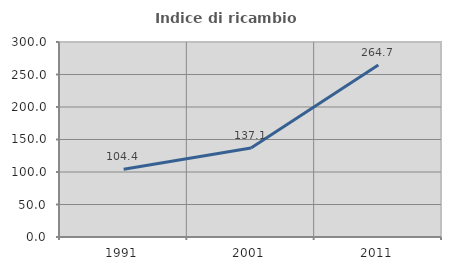
| Category | Indice di ricambio occupazionale  |
|---|---|
| 1991.0 | 104.386 |
| 2001.0 | 137.054 |
| 2011.0 | 264.744 |